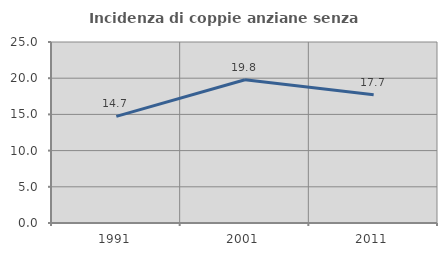
| Category | Incidenza di coppie anziane senza figli  |
|---|---|
| 1991.0 | 14.723 |
| 2001.0 | 19.785 |
| 2011.0 | 17.706 |